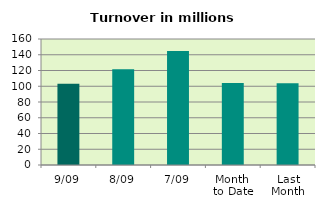
| Category | Series 0 |
|---|---|
| 9/09 | 103.135 |
| 8/09 | 121.487 |
| 7/09 | 144.797 |
| Month 
to Date | 104.242 |
| Last
Month | 103.765 |